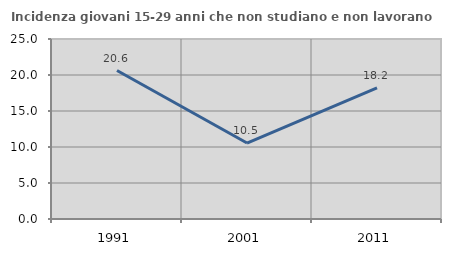
| Category | Incidenza giovani 15-29 anni che non studiano e non lavorano  |
|---|---|
| 1991.0 | 20.616 |
| 2001.0 | 10.547 |
| 2011.0 | 18.217 |